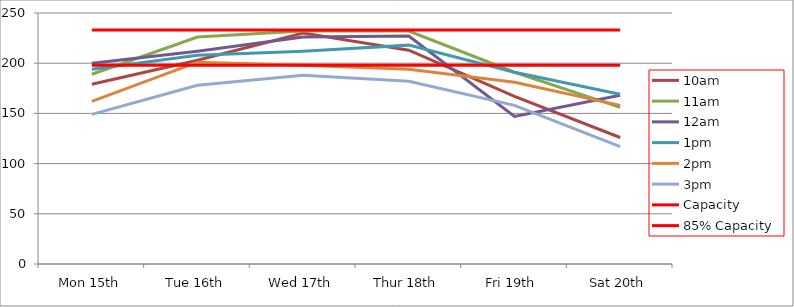
| Category | 9am | 10am | 11am | 12am | 1pm | 2pm | 3pm | 4pm | 5pm | Capacity | 85% Capacity |
|---|---|---|---|---|---|---|---|---|---|---|---|
| Mon 15th |  | 179 | 189 | 200 | 194 | 162 | 149 |  |  | 233 | 198 |
| Tue 16th |  | 203 | 226 | 212 | 208 | 201 | 178 |  |  | 233 | 198 |
| Wed 17th |  | 230 | 232 | 226 | 212 | 198 | 188 |  |  | 233 | 198 |
| Thur 18th |  | 213 | 232 | 227 | 218 | 194 | 182 |  |  | 233 | 198 |
| Fri 19th |  | 167 | 191 | 147 | 191 | 181 | 158 |  |  | 233 | 198 |
| Sat 20th |  | 126 | 156 | 168 | 169 | 158 | 117 |  |  | 233 | 198 |